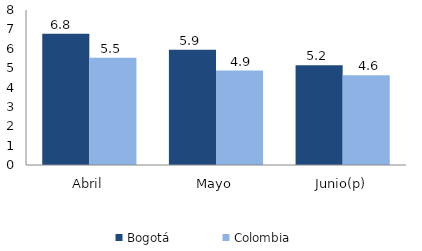
| Category | Bogotá | Colombia |
|---|---|---|
| Abril | 6.779 | 5.53 |
| Mayo | 5.943 | 4.871 |
| Junio(p) | 5.152 | 4.633 |